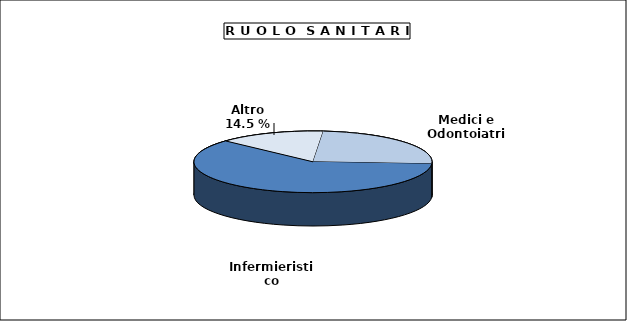
| Category | Grafico2  |
|---|---|
| Medici e Odontoiatri | 25328 |
| Infermieristico | 62439 |
| Altro | 14918 |